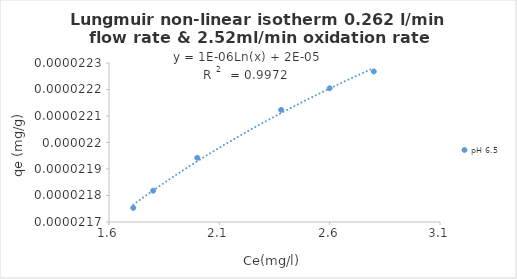
| Category | pH 6.5 |
|---|---|
| 2.8 | 0 |
| 2.6 | 0 |
| 2.38 | 0 |
| 1.8 | 0 |
| 2.0 | 0 |
| 1.71 | 0 |